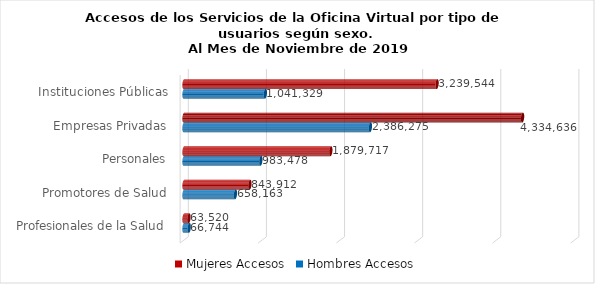
| Category | Mujeres | Hombres |
|---|---|---|
| Instituciones Públicas | 3239544 | 1041329 |
| Empresas Privadas | 4334636 | 2386275 |
| Personales | 1879717 | 983478 |
| Promotores de Salud | 843912 | 658163 |
| Profesionales de la Salud | 63520 | 66744 |